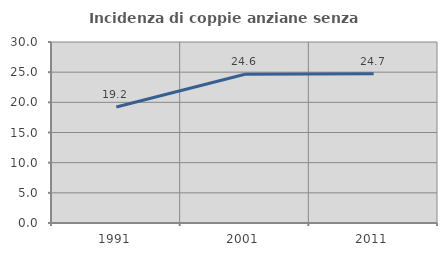
| Category | Incidenza di coppie anziane senza figli  |
|---|---|
| 1991.0 | 19.216 |
| 2001.0 | 24.645 |
| 2011.0 | 24.731 |